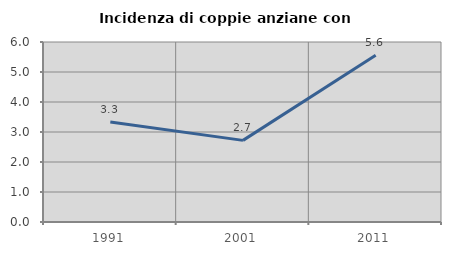
| Category | Incidenza di coppie anziane con figli |
|---|---|
| 1991.0 | 3.333 |
| 2001.0 | 2.721 |
| 2011.0 | 5.556 |